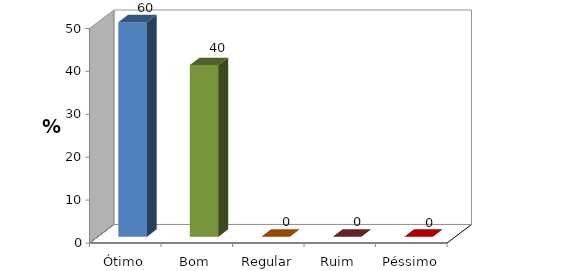
| Category | Series 0 |
|---|---|
| Ótimo | 60 |
| Bom | 40 |
| Regular | 0 |
| Ruim | 0 |
| Péssimo | 0 |